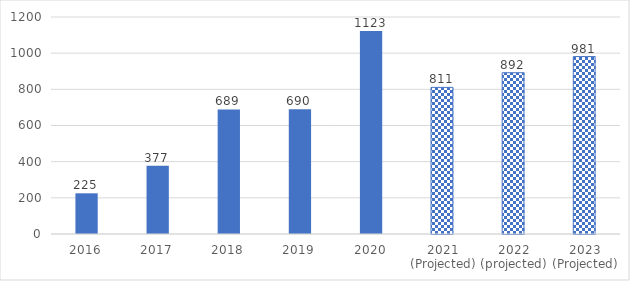
| Category | Series 0 |
|---|---|
| 2016 | 225 |
| 2017 | 377 |
| 2018 | 689 |
| 2019 | 690 |
| 2020 | 1123 |
| 2021 (Projected) | 810.764 |
| 2022 (projected) | 891.84 |
| 2023 (Projected) | 981.024 |